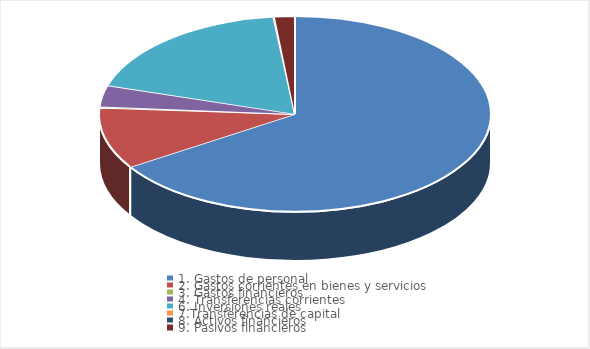
| Category | Series 0 |
|---|---|
| 1. Gastos de personal | 211476358.46 |
| 2. Gastos corrientes en bienes y servicios | 32525132.07 |
| 3. Gastos financieros | 591082.4 |
| 4. Transferencias corrientes | 11261141.72 |
| 6. Inversiones reales | 59450630.07 |
| 7.Transferencias de capital | 352360.4 |
| 8. Activos financieros | 30600 |
| 9. Pasivos financieros | 5291437.46 |